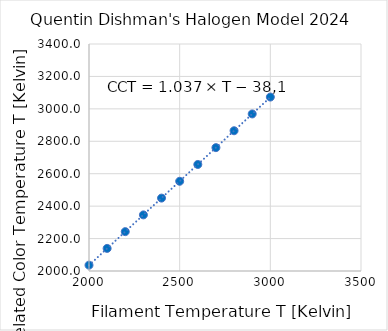
| Category | Series 0 |
|---|---|
| 2000.0 | 2036.1 |
| 2100.0 | 2139.4 |
| 2200.0 | 2242.7 |
| 2300.0 | 2346.1 |
| 2400.0 | 2449.6 |
| 2500.0 | 2553.3 |
| 2600.0 | 2657 |
| 2700.0 | 2760.8 |
| 2800.0 | 2864.9 |
| 2900.0 | 2968.7 |
| 3000.0 | 3072.8 |